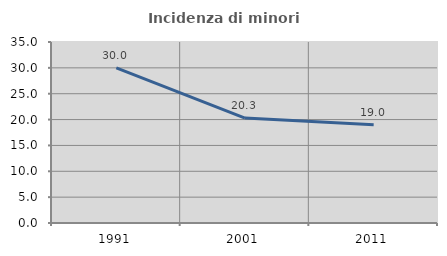
| Category | Incidenza di minori stranieri |
|---|---|
| 1991.0 | 30 |
| 2001.0 | 20.29 |
| 2011.0 | 18.994 |